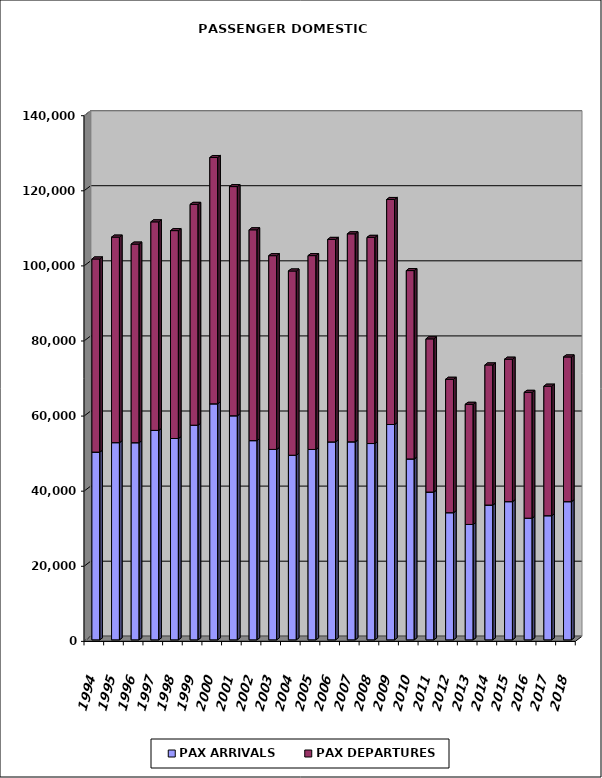
| Category | PAX ARRIVALS | PAX DEPARTURES |
|---|---|---|
| 1994.0 | 50004 | 51435 |
| 1995.0 | 52525 | 54732 |
| 1996.0 | 52510 | 52890 |
| 1997.0 | 55790 | 55536 |
| 1998.0 | 53622 | 55368 |
| 1999.0 | 57174 | 58805 |
| 2000.0 | 62864 | 65593 |
| 2001.0 | 59684 | 61032 |
| 2002.0 | 53062 | 56145 |
| 2003.0 | 50721 | 51600 |
| 2004.0 | 49170 | 49068 |
| 2005.0 | 50706 | 51628 |
| 2006.0 | 52724 | 53925 |
| 2007.0 | 52741 | 55398 |
| 2008.0 | 52286 | 54908 |
| 2009.0 | 57350 | 59931 |
| 2010.0 | 48184 | 50162 |
| 2011.0 | 39364 | 40802 |
| 2012.0 | 33870 | 35528 |
| 2013.0 | 30730 | 32003 |
| 2014.0 | 35904 | 37315 |
| 2015.0 | 36810 | 37936 |
| 2016.0 | 32404 | 33514 |
| 2017.0 | 33065 | 34494 |
| 2018.0 | 36808 | 38537 |